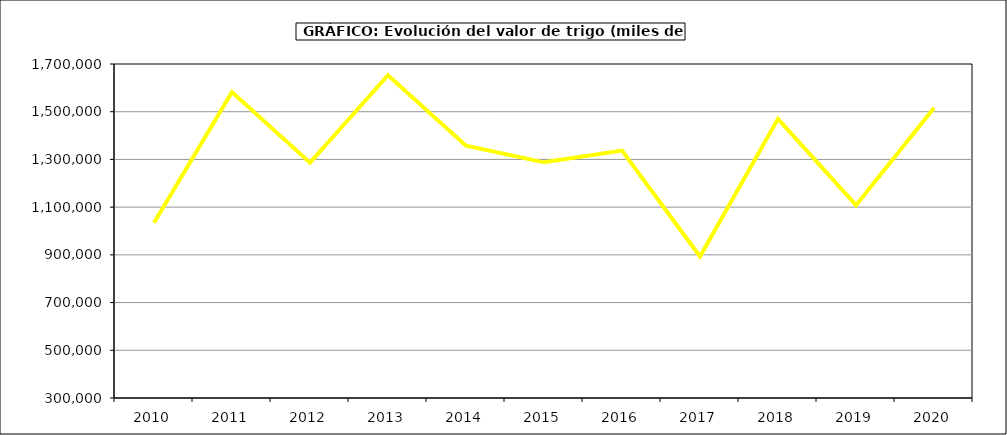
| Category | Valor |
|---|---|
| 2010.0 | 1034362.398 |
| 2011.0 | 1582317.395 |
| 2012.0 | 1286558.361 |
| 2013.0 | 1652767.635 |
| 2014.0 | 1357332.32 |
| 2015.0 | 1287809 |
| 2016.0 | 1336858 |
| 2017.0 | 893127.676 |
| 2018.0 | 1470167.37 |
| 2019.0 | 1108130.614 |
| 2020.0 | 1515727.934 |